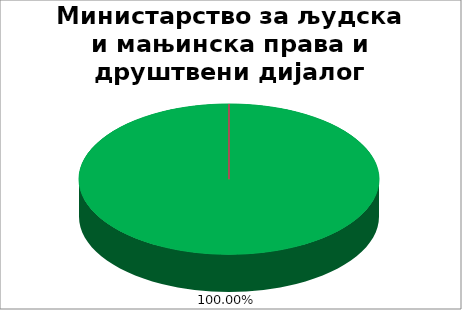
| Category | Министарство за људска и мањинска права и друштвени дијалог |
|---|---|
| 0 | 1 |
| 1 | 0 |
| 2 | 0 |
| 3 | 0 |
| 4 | 0 |